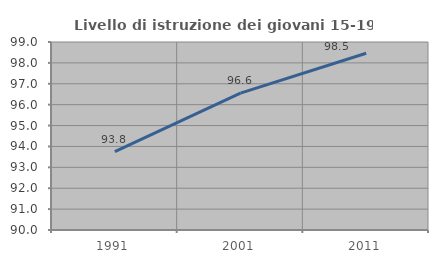
| Category | Livello di istruzione dei giovani 15-19 anni |
|---|---|
| 1991.0 | 93.75 |
| 2001.0 | 96.552 |
| 2011.0 | 98.462 |